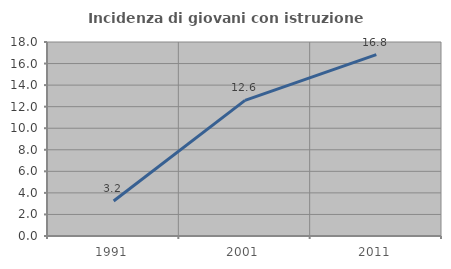
| Category | Incidenza di giovani con istruzione universitaria |
|---|---|
| 1991.0 | 3.248 |
| 2001.0 | 12.579 |
| 2011.0 | 16.828 |